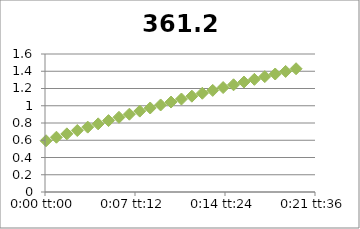
| Category | 361.2 |
|---|---|
| 5.78703703703704e-05 | 0.594 |
| 0.000636574074074074 | 0.635 |
| 0.00121527777777778 | 0.674 |
| 0.00179398148148148 | 0.713 |
| 0.00237268518518518 | 0.752 |
| 0.00295138888888889 | 0.79 |
| 0.00353009259259259 | 0.828 |
| 0.0041087962962963 | 0.866 |
| 0.0046875 | 0.902 |
| 0.0052662037037037 | 0.938 |
| 0.00584490740740741 | 0.974 |
| 0.00642361111111111 | 1.009 |
| 0.00700231481481481 | 1.043 |
| 0.00758101851851852 | 1.078 |
| 0.00815972222222222 | 1.111 |
| 0.00873842592592592 | 1.145 |
| 0.00931712962962963 | 1.178 |
| 0.00989583333333333 | 1.211 |
| 0.010474537037037 | 1.243 |
| 0.0110532407407407 | 1.275 |
| 0.0116319444444444 | 1.306 |
| 0.0122106481481481 | 1.338 |
| 0.0127893518518518 | 1.368 |
| 0.0133680555555556 | 1.398 |
| 0.0139467592592593 | 1.429 |